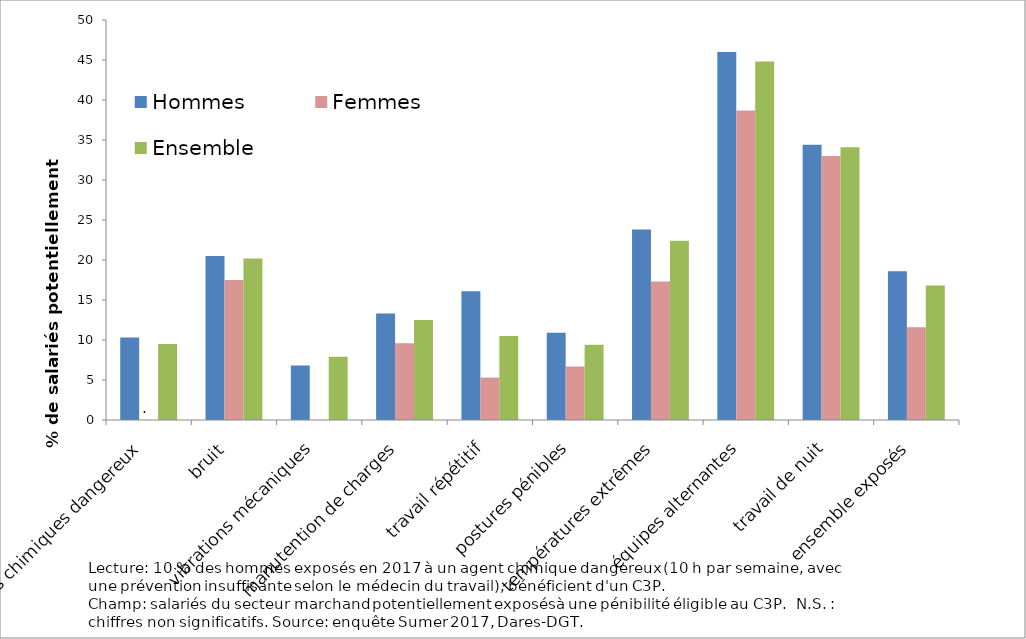
| Category | Hommes | Femmes | Ensemble |
|---|---|---|---|
| agents chimiques dangereux | 10.3 | 0 | 9.5 |
| bruit  | 20.5 | 17.5 | 20.2 |
| vibrations mécaniques | 6.8 | 0 | 7.9 |
| manutention de charges | 13.3 | 9.6 | 12.5 |
| travail répétitif | 16.1 | 5.3 | 10.5 |
| postures pénibles | 10.9 | 6.7 | 9.4 |
| températures extrêmes | 23.8 | 17.3 | 22.4 |
| équipes alternantes | 46 | 38.7 | 44.8 |
| travail de nuit  | 34.4 | 33 | 34.1 |
| ensemble exposés | 18.6 | 11.6 | 16.8 |